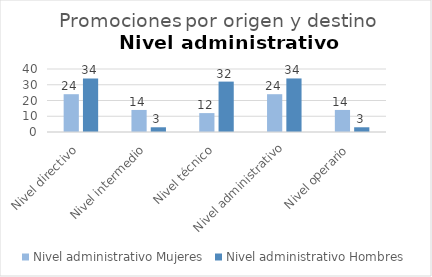
| Category | Nivel administrativo |
|---|---|
| Nivel directivo | 34 |
| Nivel intermedio | 3 |
| Nivel técnico | 32 |
| Nivel administrativo | 34 |
| Nivel operario | 3 |